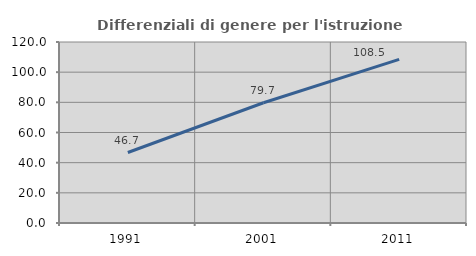
| Category | Differenziali di genere per l'istruzione superiore |
|---|---|
| 1991.0 | 46.729 |
| 2001.0 | 79.725 |
| 2011.0 | 108.475 |